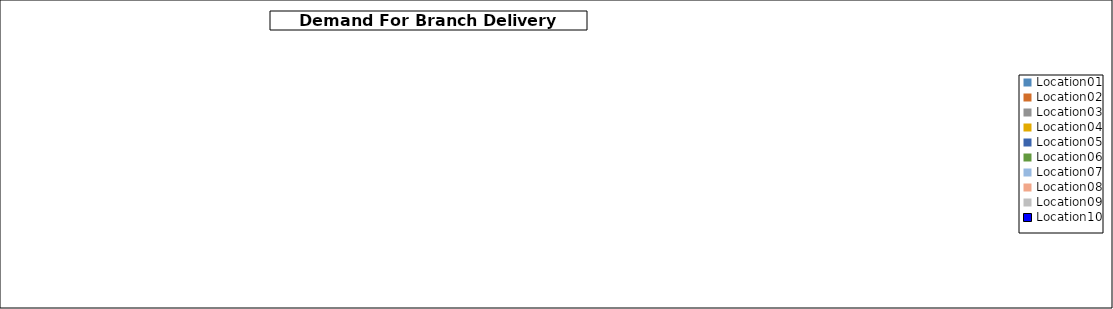
| Category | Data A |
|---|---|
| Location01 | 0 |
| Location02 | 0 |
| Location03 | 0 |
| Location04 | 0 |
| Location05 | 0 |
| Location06 | 0 |
| Location07 | 0 |
| Location08 | 0 |
| Location09 | 0 |
| Location10 | 0 |